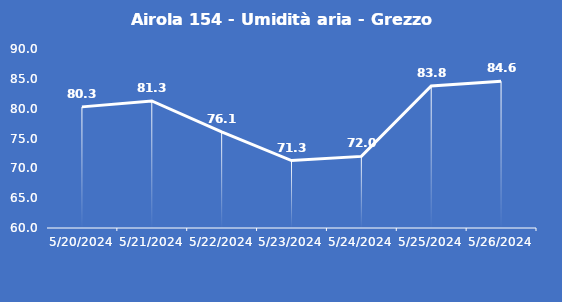
| Category | Airola 154 - Umidità aria - Grezzo (%) |
|---|---|
| 5/20/24 | 80.3 |
| 5/21/24 | 81.3 |
| 5/22/24 | 76.1 |
| 5/23/24 | 71.3 |
| 5/24/24 | 72 |
| 5/25/24 | 83.8 |
| 5/26/24 | 84.6 |